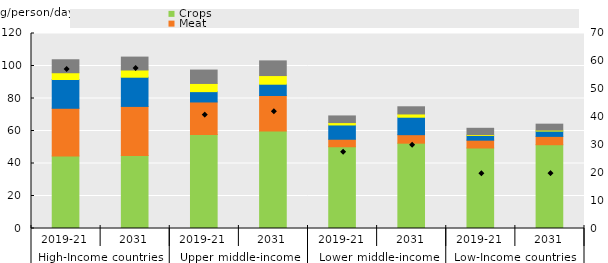
| Category | Crops | Meat | Dairy | Egg | Fish |
|---|---|---|---|---|---|
| 0 | 44.578 | 29.407 | 17.69 | 4.183 | 7.987 |
| 1 | 44.898 | 30.23 | 17.97 | 4.441 | 7.943 |
| 2 | 57.824 | 20.042 | 6.359 | 5.037 | 8.234 |
| 3 | 59.934 | 21.907 | 6.949 | 5.333 | 9.023 |
| 4 | 50.305 | 4.626 | 8.782 | 1.464 | 4.093 |
| 5 | 52.513 | 5.222 | 10.744 | 2.004 | 4.419 |
| 6 | 49.536 | 4.819 | 2.873 | 0.521 | 3.919 |
| 7 | 51.552 | 5.135 | 3.262 | 0.602 | 3.655 |